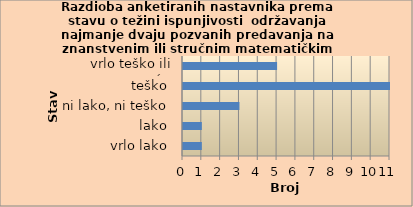
| Category | Series 0 |
|---|---|
| vrlo lako | 1 |
| lako | 1 |
| ni lako, ni teško | 3 |
| teško | 11 |
| vrlo teško ili nemoguće | 5 |